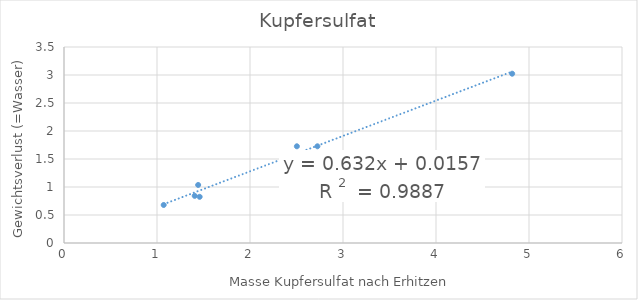
| Category | Series 0 |
|---|---|
| 1.4426 | 1.036 |
| 1.4586 | 0.825 |
| 1.072 | 0.679 |
| 2.504 | 1.727 |
| 2.725 | 1.727 |
| 1.4055 | 0.842 |
| 4.819 | 3.023 |